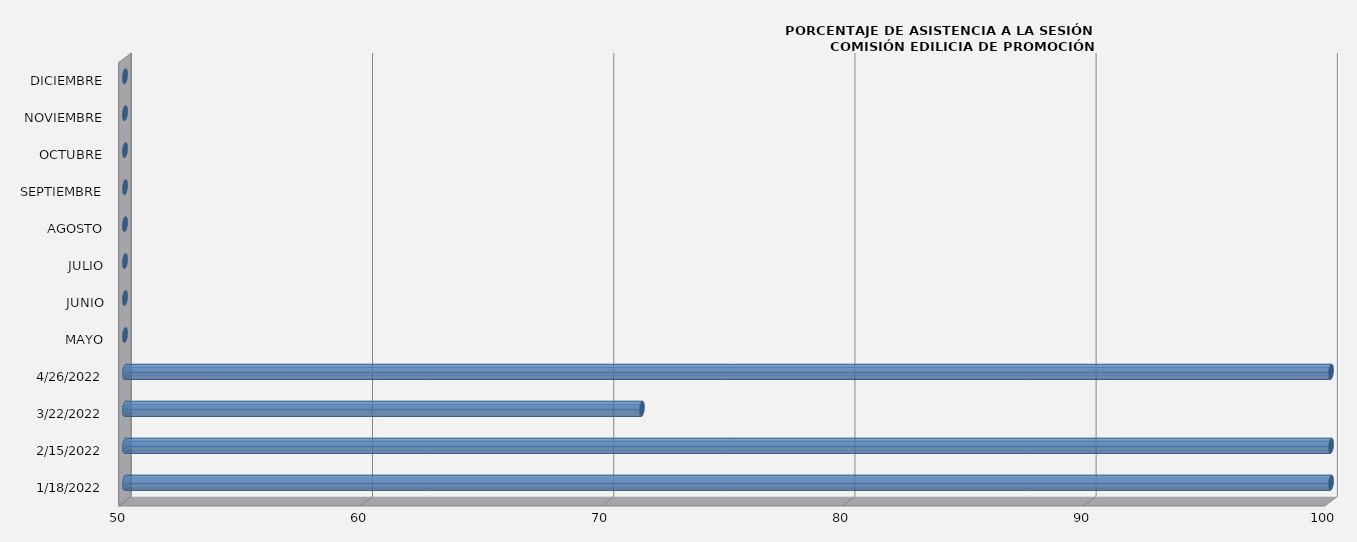
| Category | Series 0 |
|---|---|
| 18/01/2022 | 100 |
| 15/02/2022 | 100 |
| 22/03/2022 | 71.429 |
| 26/04/2022 | 100 |
| MAYO | 0 |
| JUNIO | 0 |
| JULIO | 0 |
| AGOSTO | 0 |
| SEPTIEMBRE | 0 |
| OCTUBRE | 0 |
| NOVIEMBRE | 0 |
| DICIEMBRE | 0 |